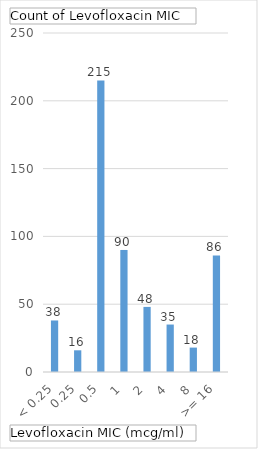
| Category | Total |
|---|---|
| < 0.25 | 38 |
| 0.25 | 16 |
| 0.5 | 215 |
| 1 | 90 |
| 2 | 48 |
| 4 | 35 |
| 8 | 18 |
| >= 16 | 86 |